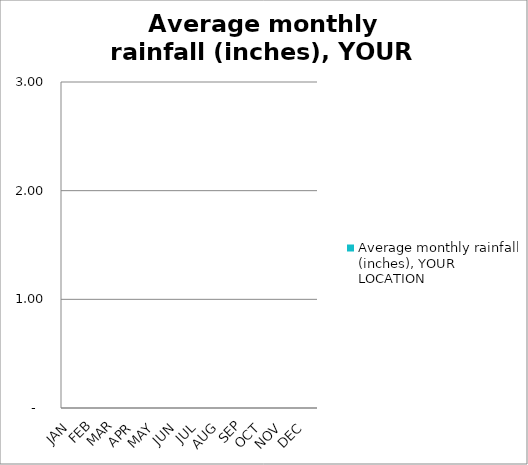
| Category | Average monthly rainfall (inches), YOUR LOCATION |
|---|---|
| JAN | 0 |
| FEB | 0 |
| MAR | 0 |
| APR | 0 |
| MAY | 0 |
| JUN | 0 |
| JUL | 0 |
| AUG | 0 |
| SEP | 0 |
| OCT | 0 |
| NOV | 0 |
| DEC | 0 |